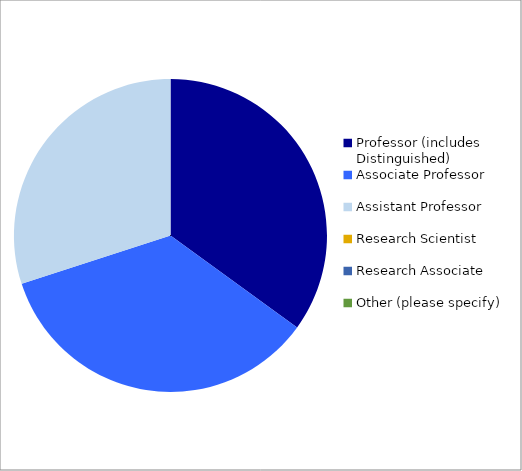
| Category | Series 0 |
|---|---|
| Professor (includes Distinguished) | 0.35 |
| Associate Professor | 0.35 |
| Assistant Professor | 0.3 |
| Research Scientist | 0 |
| Research Associate | 0 |
| Other (please specify) | 0 |